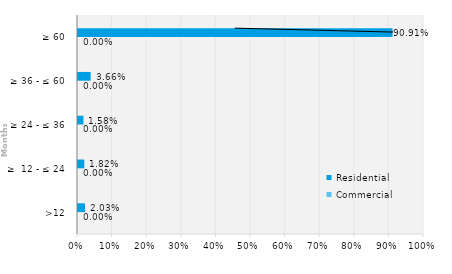
| Category | Commercial | Residential |
|---|---|---|
| >12 | 0 | 0.02 |
| ≥  12 - ≤ 24 | 0 | 0.018 |
| ≥ 24 - ≤ 36 | 0 | 0.016 |
| ≥ 36 - ≤ 60 | 0 | 0.037 |
| ≥ 60 | 0 | 0.909 |